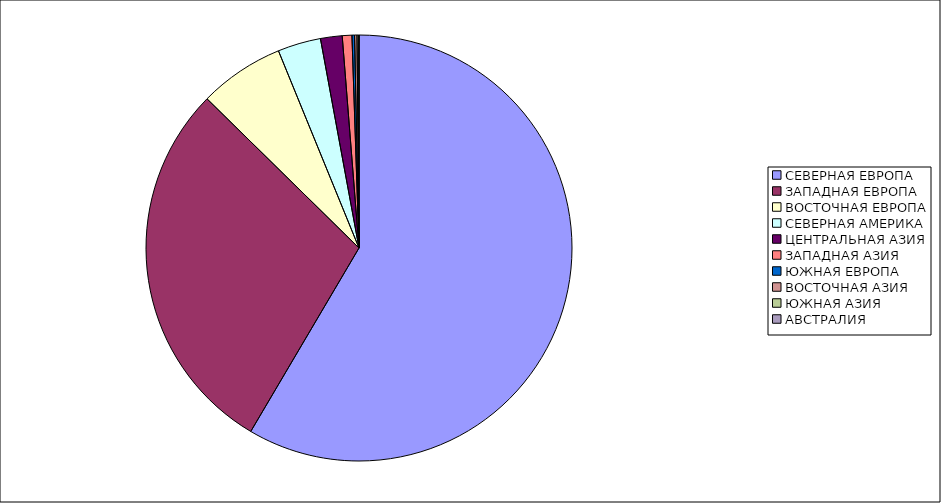
| Category | Оборот |
|---|---|
| СЕВЕРНАЯ ЕВРОПА | 58.484 |
| ЗАПАДНАЯ ЕВРОПА | 28.869 |
| ВОСТОЧНАЯ ЕВРОПА | 6.475 |
| СЕВЕРНАЯ АМЕРИКА | 3.272 |
| ЦЕНТРАЛЬНАЯ АЗИЯ | 1.642 |
| ЗАПАДНАЯ АЗИЯ | 0.73 |
| ЮЖНАЯ ЕВРОПА | 0.197 |
| ВОСТОЧНАЯ АЗИЯ | 0.182 |
| ЮЖНАЯ АЗИЯ | 0.141 |
| АВСТРАЛИЯ | 0.009 |